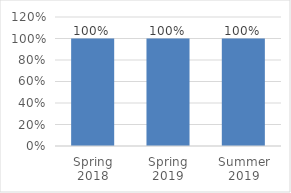
| Category | Series 0 |
|---|---|
| Spring 2018 | 1 |
| Spring 2019 | 1 |
| Summer 2019 | 1 |